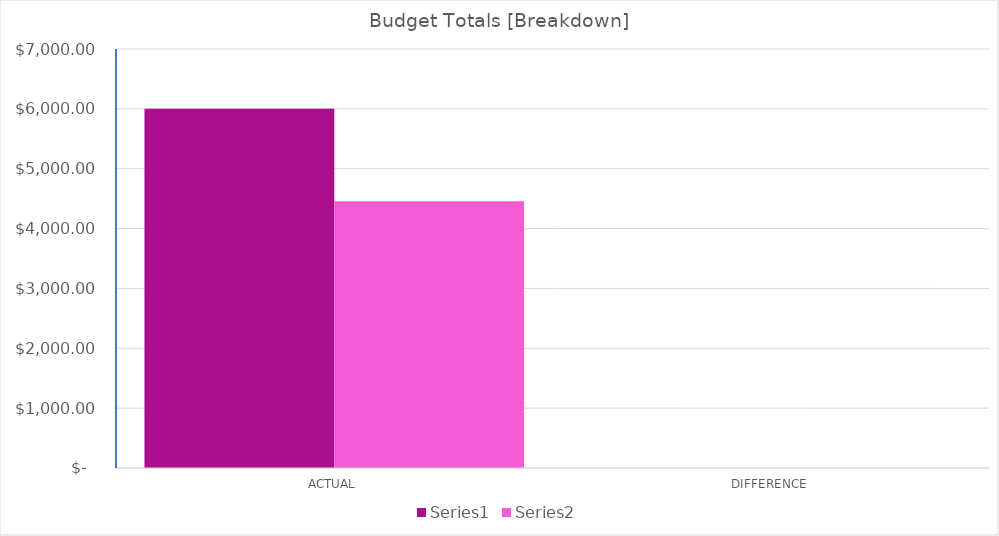
| Category | Series 0 | Series 1 |
|---|---|---|
| ACTUAL | 6000 | 4455.63 |
| DIFFERENCE | 0 | 0 |